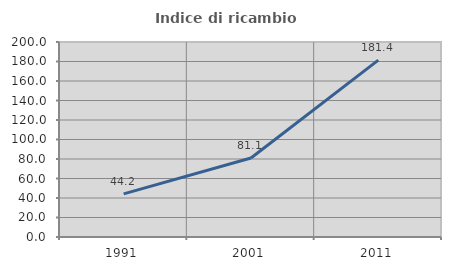
| Category | Indice di ricambio occupazionale  |
|---|---|
| 1991.0 | 44.244 |
| 2001.0 | 81.053 |
| 2011.0 | 181.443 |